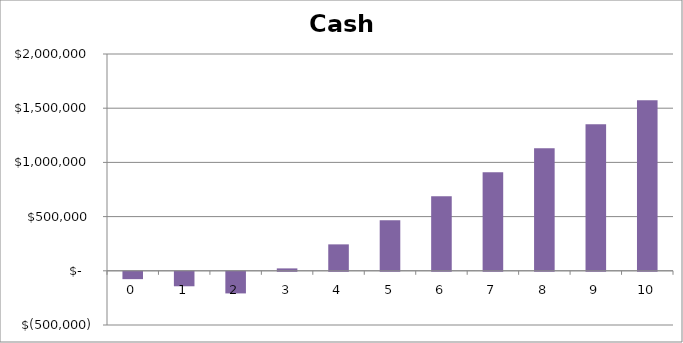
| Category | Cash Balance |
|---|---|
| 0.0 | -67700 |
| 1.0 | -133558.121 |
| 2.0 | -199416.243 |
| 3.0 | 22225.636 |
| 4.0 | 243867.515 |
| 5.0 | 465509.393 |
| 6.0 | 687151.272 |
| 7.0 | 908793.151 |
| 8.0 | 1130435.029 |
| 9.0 | 1352076.908 |
| 10.0 | 1573718.787 |